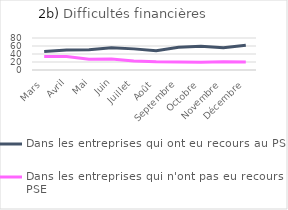
| Category | Dans les entreprises qui ont eu recours au PSE  | Dans les entreprises qui n'ont pas eu recours au PSE  |
|---|---|---|
| Mars | 46.486 | 33.588 |
| Avril | 50.133 | 33.657 |
| Mai | 50.828 | 27.12 |
| Juin | 55.79 | 27.217 |
| Juillet | 52.811 | 22.672 |
| Août | 47.942 | 20.396 |
| Septembre | 57.125 | 19.841 |
| Octobre | 59.504 | 19.483 |
| Novembre | 55.52 | 20.717 |
| Décembre | 62.09 | 20.068 |